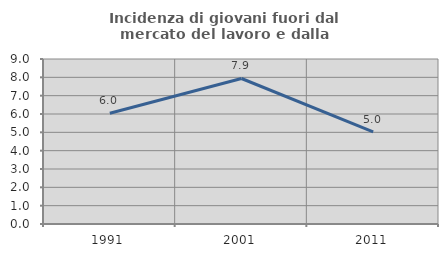
| Category | Incidenza di giovani fuori dal mercato del lavoro e dalla formazione  |
|---|---|
| 1991.0 | 6.044 |
| 2001.0 | 7.937 |
| 2011.0 | 5.025 |